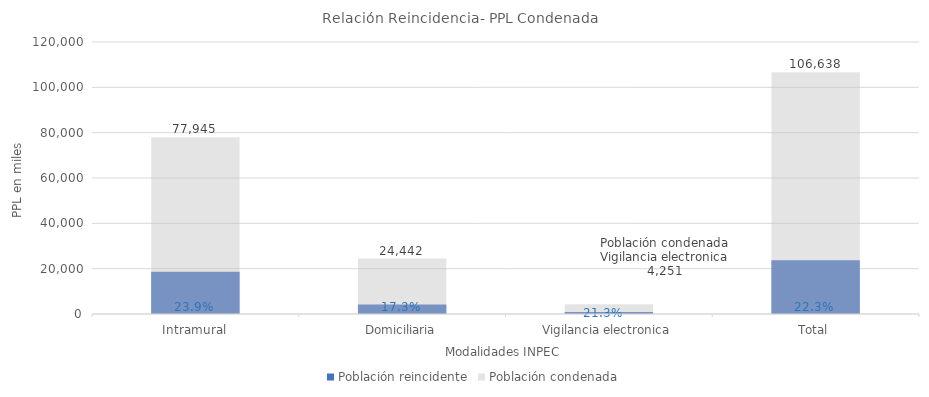
| Category | Población reincidente | Población condenada |
|---|---|---|
| Intramural | 18606 | 77945 |
| Domiciliaria | 4240 | 24442 |
| Vigilancia electronica | 906 | 4251 |
| Total | 23752 | 106638 |